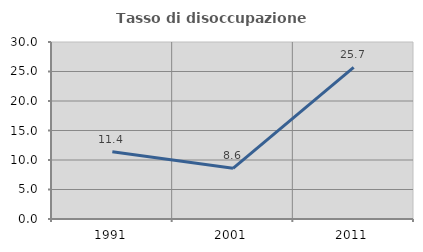
| Category | Tasso di disoccupazione giovanile  |
|---|---|
| 1991.0 | 11.413 |
| 2001.0 | 8.594 |
| 2011.0 | 25.714 |